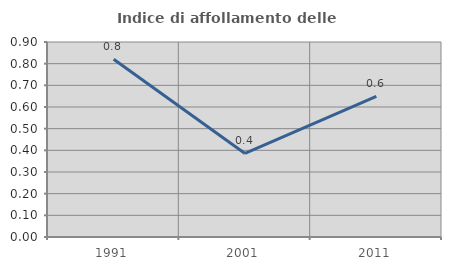
| Category | Indice di affollamento delle abitazioni  |
|---|---|
| 1991.0 | 0.82 |
| 2001.0 | 0.386 |
| 2011.0 | 0.649 |